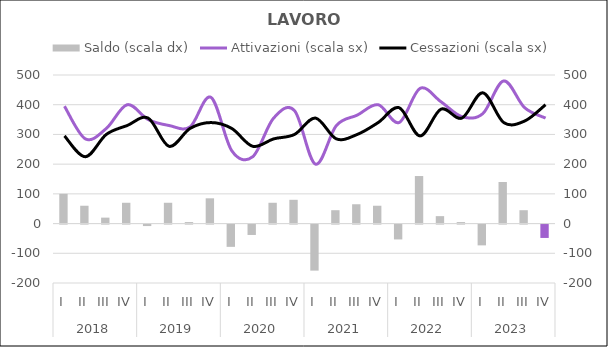
| Category | Saldo (scala dx) |
|---|---|
| 0 | 100 |
| 1 | 60 |
| 2 | 20 |
| 3 | 70 |
| 4 | -5 |
| 5 | 70 |
| 6 | 5 |
| 7 | 85 |
| 8 | -75 |
| 9 | -35 |
| 10 | 70 |
| 11 | 80 |
| 12 | -155 |
| 13 | 45 |
| 14 | 65 |
| 15 | 60 |
| 16 | -50 |
| 17 | 160 |
| 18 | 25 |
| 19 | 5 |
| 20 | -70 |
| 21 | 140 |
| 22 | 45 |
| 23 | -45 |